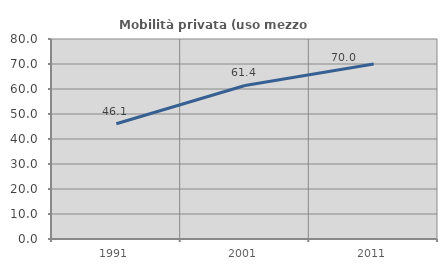
| Category | Mobilità privata (uso mezzo privato) |
|---|---|
| 1991.0 | 46.08 |
| 2001.0 | 61.413 |
| 2011.0 | 69.967 |